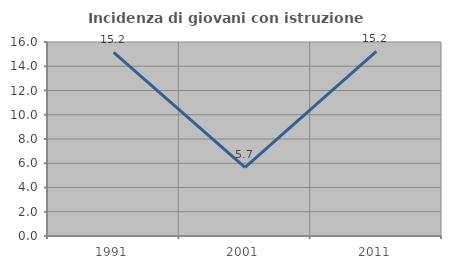
| Category | Incidenza di giovani con istruzione universitaria |
|---|---|
| 1991.0 | 15.152 |
| 2001.0 | 5.66 |
| 2011.0 | 15.217 |